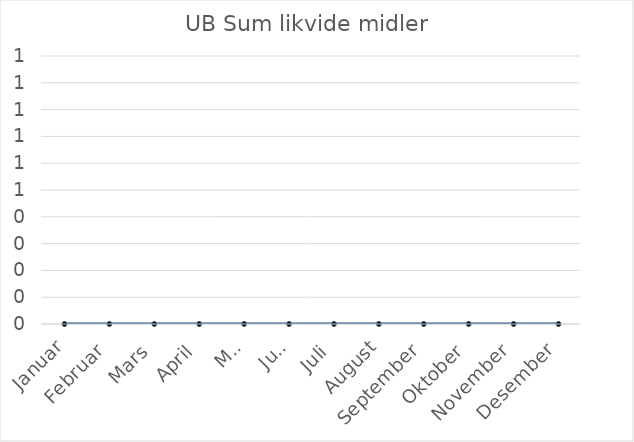
| Category | UB Sum likvide midler |
|---|---|
| Januar | 0 |
| Februar | 0 |
| Mars | 0 |
| April | 0 |
| Mai | 0 |
| Juni | 0 |
| Juli | 0 |
| August | 0 |
| September | 0 |
| Oktober | 0 |
| November | 0 |
| Desember | 0 |